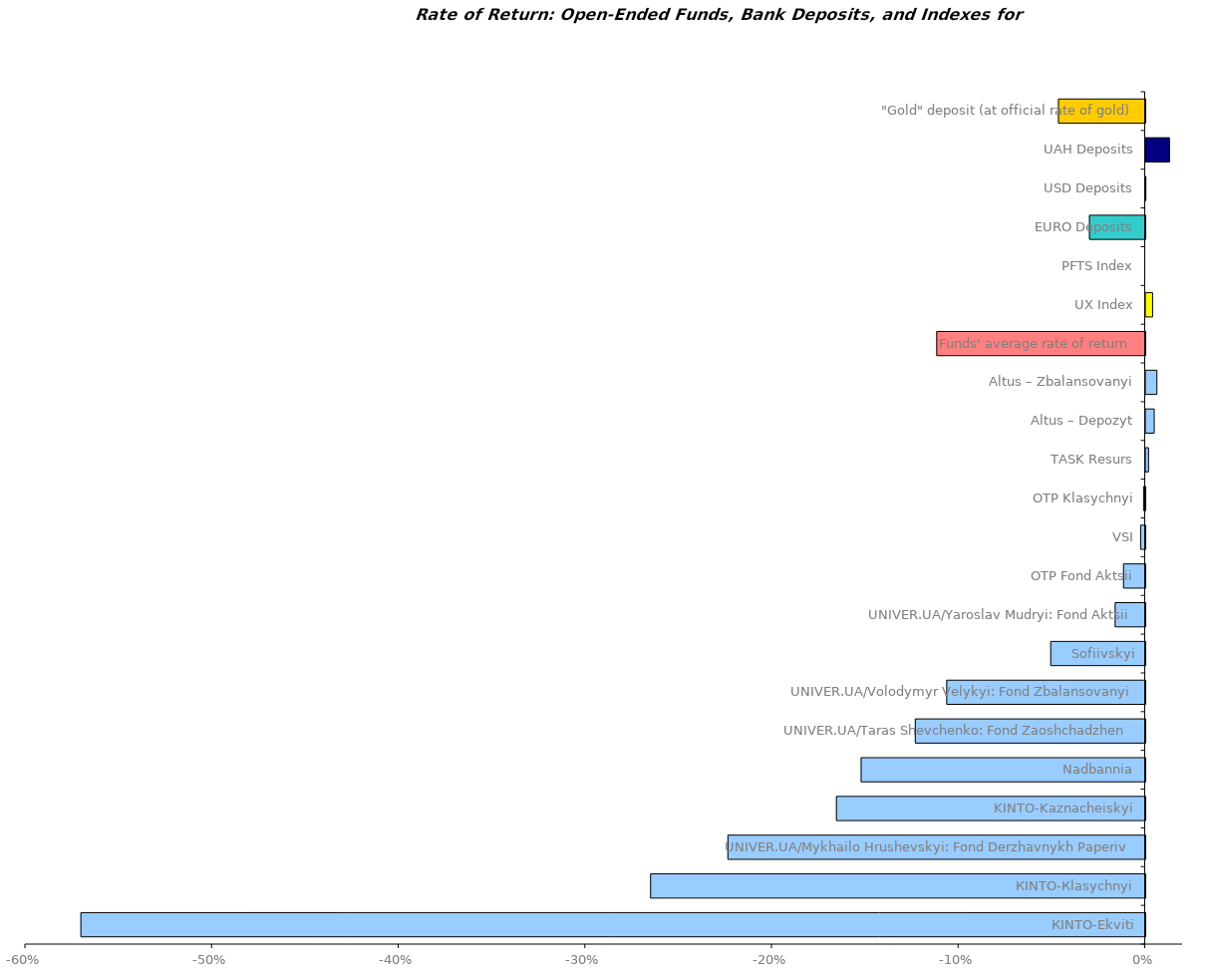
| Category | Series 0 |
|---|---|
| КІNTO-Ekviti | -0.57 |
| КINТО-Кlasychnyi | -0.265 |
| UNIVER.UA/Мykhailo Hrushevskyi: Fond Derzhavnykh Paperiv | -0.224 |
| KINTO-Kaznacheiskyi | -0.165 |
| Nadbannia | -0.152 |
| UNIVER.UA/Taras Shevchenko: Fond Zaoshchadzhen | -0.123 |
| UNIVER.UA/Volodymyr Velykyi: Fond Zbalansovanyi | -0.106 |
| Sofiivskyi | -0.051 |
| UNIVER.UA/Yaroslav Mudryi: Fond Aktsii | -0.016 |
| ОТP Fond Aktsii | -0.012 |
| VSI | -0.002 |
| ОТP Klasychnyi | -0.001 |
| ТАSK Resurs | 0.001 |
| Altus – Depozyt | 0.005 |
| Altus – Zbalansovanyi | 0.006 |
| Funds' average rate of return | -0.112 |
| UX Index | 0.004 |
| PFTS Index | 0 |
| EURO Deposits | -0.03 |
| USD Deposits | 0 |
| UAH Deposits | 0.013 |
| "Gold" deposit (at official rate of gold) | -0.046 |